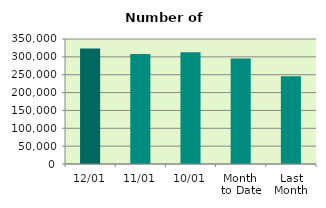
| Category | Series 0 |
|---|---|
| 12/01 | 323676 |
| 11/01 | 307952 |
| 10/01 | 313102 |
| Month 
to Date | 295505.111 |
| Last
Month | 245553.619 |